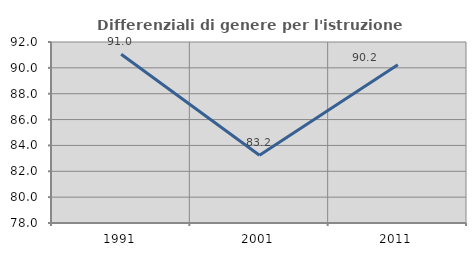
| Category | Differenziali di genere per l'istruzione superiore |
|---|---|
| 1991.0 | 91.049 |
| 2001.0 | 83.241 |
| 2011.0 | 90.243 |